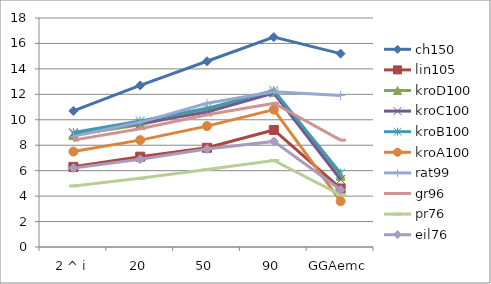
| Category | ch150 | lin105 | kroD100 | kroC100 | kroB100 | kroA100 | rat99 | gr96 | pr76 | eil76 |
|---|---|---|---|---|---|---|---|---|---|---|
| 2 ^ i | 10.7 | 6.3 | 8.8 | 8.9 | 9 | 7.5 | 8.7 | 8.4 | 4.8 | 6.2 |
| 20 | 12.7 | 7.1 | 9.6 | 9.7 | 9.9 | 8.4 | 9.8 | 9.3 | 5.4 | 6.9 |
| 50 | 14.6 | 7.8 | 10.8 | 10.6 | 10.9 | 9.5 | 11.3 | 10.4 | 6.1 | 7.7 |
| 90 | 16.5 | 9.2 | 12.2 | 12.1 | 12.3 | 10.8 | 12.2 | 11.3 | 6.8 | 8.3 |
| GGAemc | 15.2 | 4.6 | 5.6 | 5.3 | 5.8 | 3.6 | 11.9 | 8.4 | 4.1 | 4.5 |